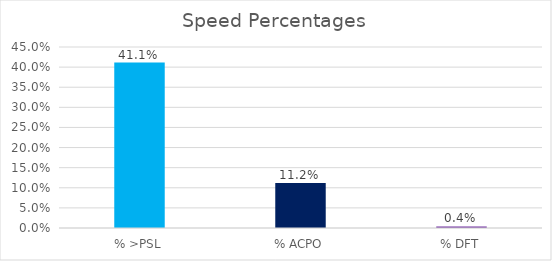
| Category | Series 0 |
|---|---|
| % >PSL | 0.411 |
| % ACPO | 0.112 |
| % DFT | 0.004 |